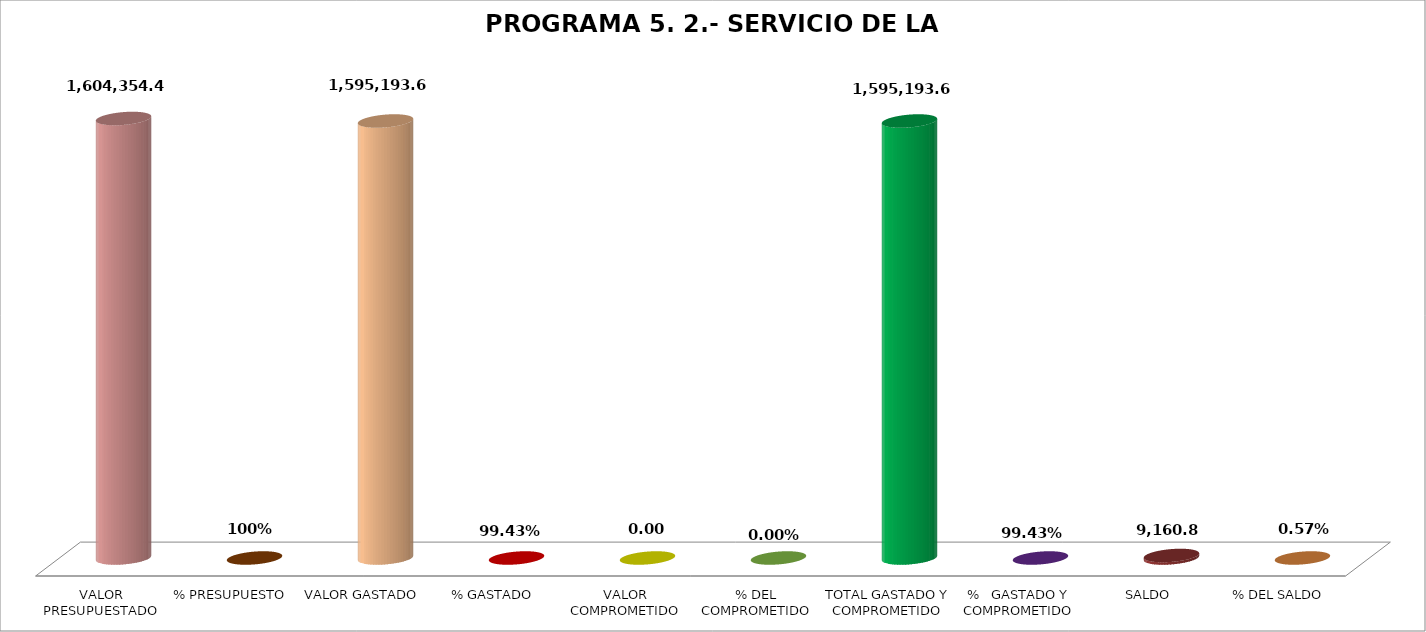
| Category | PROGRAMA 5. 2.- SERVICIO DE LA DEUDA |
|---|---|
| VALOR PRESUPUESTADO | 1604354.48 |
| % PRESUPUESTO | 1 |
| VALOR GASTADO | 1595193.68 |
| % GASTADO | 0.994 |
| VALOR COMPROMETIDO | 0 |
| % DEL COMPROMETIDO | 0 |
| TOTAL GASTADO Y COMPROMETIDO | 1595193.68 |
| %   GASTADO Y COMPROMETIDO | 0.994 |
| SALDO | 9160.8 |
| % DEL SALDO | 0.006 |